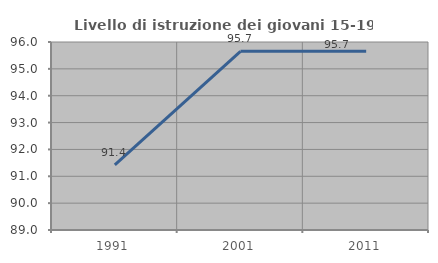
| Category | Livello di istruzione dei giovani 15-19 anni |
|---|---|
| 1991.0 | 91.429 |
| 2001.0 | 95.652 |
| 2011.0 | 95.652 |